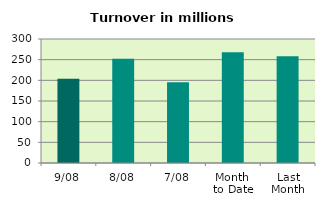
| Category | Series 0 |
|---|---|
| 9/08 | 204.04 |
| 8/08 | 252.118 |
| 7/08 | 195.656 |
| Month 
to Date | 267.653 |
| Last
Month | 258.125 |